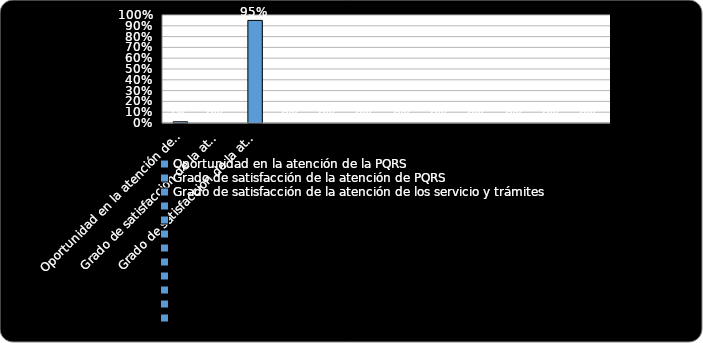
| Category | % Cumplimiento  |
|---|---|
| Oportunidad en la atención de la PQRS  | 0.011 |
| Grado de satisfacción de la atención de PQRS  | 0 |
| Grado de satisfacción de la atención de los servicio y trámites | 0.95 |